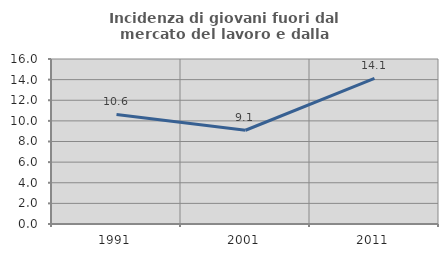
| Category | Incidenza di giovani fuori dal mercato del lavoro e dalla formazione  |
|---|---|
| 1991.0 | 10.619 |
| 2001.0 | 9.091 |
| 2011.0 | 14.118 |